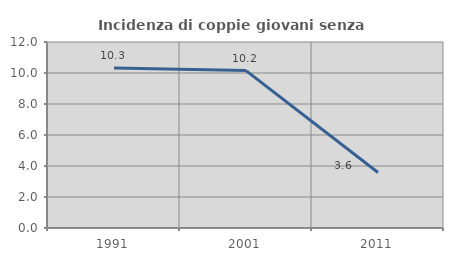
| Category | Incidenza di coppie giovani senza figli |
|---|---|
| 1991.0 | 10.316 |
| 2001.0 | 10.153 |
| 2011.0 | 3.584 |